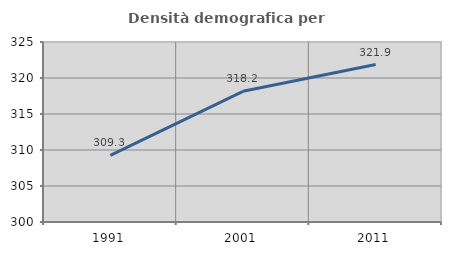
| Category | Densità demografica |
|---|---|
| 1991.0 | 309.265 |
| 2001.0 | 318.156 |
| 2011.0 | 321.866 |